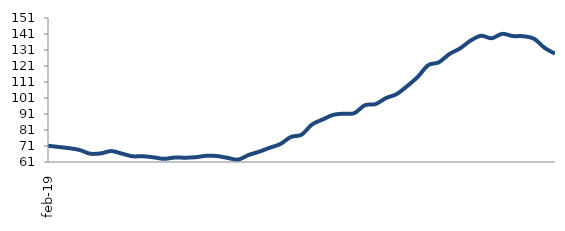
| Category | Series 0 |
|---|---|
| 2019-02-01 | 71.168 |
| 2019-03-01 | 70.395 |
| 2019-04-01 | 69.635 |
| 2019-05-01 | 68.49 |
| 2019-06-01 | 66.189 |
| 2019-07-01 | 66.392 |
| 2019-08-01 | 67.837 |
| 2019-09-01 | 66.22 |
| 2019-10-01 | 64.573 |
| 2019-11-01 | 64.608 |
| 2019-12-01 | 63.908 |
| 2020-01-01 | 62.959 |
| 2020-02-01 | 63.811 |
| 2020-03-01 | 63.665 |
| 2020-04-01 | 64.013 |
| 2020-05-01 | 64.885 |
| 2020-06-01 | 64.73 |
| 2020-07-01 | 63.568 |
| 2020-08-01 | 62.507 |
| 2020-09-01 | 65.409 |
| 2020-10-01 | 67.466 |
| 2020-11-01 | 69.929 |
| 2020-12-01 | 72.262 |
| 2021-01-01 | 76.667 |
| 2021-02-01 | 78.05 |
| 2021-03-01 | 84.474 |
| 2021-04-01 | 87.564 |
| 2021-05-01 | 90.47 |
| 2021-06-01 | 91.204 |
| 2021-07-01 | 91.538 |
| 2021-08-01 | 96.497 |
| 2021-09-01 | 97.152 |
| 2021-10-01 | 100.957 |
| 2021-11-01 | 103.422 |
| 2021-12-01 | 108.432 |
| 2022-01-01 | 114.175 |
| 2022-02-01 | 121.528 |
| 2022-03-01 | 123.298 |
| 2022-04-01 | 128.467 |
| 2022-05-01 | 131.948 |
| 2022-06-01 | 136.827 |
| 2022-07-01 | 139.894 |
| 2022-08-01 | 138.341 |
| 2022-09-01 | 141.078 |
| 2022-10-01 | 139.73 |
| 2022-11-01 | 139.602 |
| 2022-12-01 | 138.086 |
| 2023-01-01 | 132.43 |
| 2023-02-01 | 128.69 |